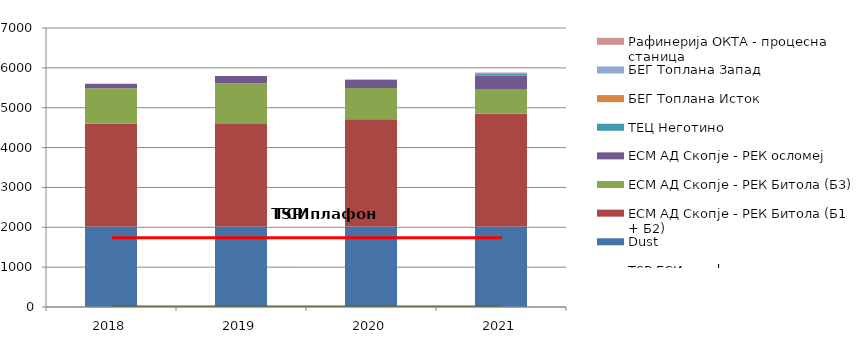
| Category | Dust | EСМ AД Скопје - РЕК Битола (Б1 + Б2) | EСМ AД Скопје - РЕК Битола (Б3) | EСМ AД Скопје - РЕК осломеј | ТЕЦ Неготино | БЕГ Топлана Исток | БЕГ Топлана Запад | Рафинерија ОКТА - процесна станица |
|---|---|---|---|---|---|---|---|---|
| 2018.0 | 2018 | 2582 | 888 | 115 | 0 | 0.58 | 0.34 | 0 |
| 2019.0 | 2019 | 2575 | 1021 | 181 | 0 | 0.82 | 0.36 | 0 |
| 2020.0 | 2020 | 2688 | 784 | 212 | 0 | 0.91 | 0.47 | 0 |
| 2021.0 | 2021 | 2829 | 621 | 339 | 43.2 | 21.9 | 7.59 | 0 |